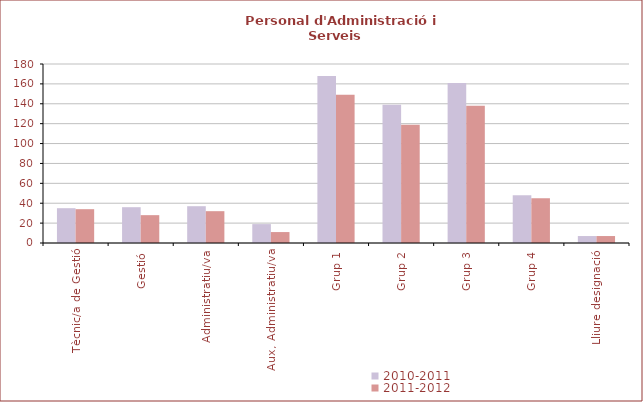
| Category | 2010-2011 | 2011-2012 |
|---|---|---|
| Tècnic/a de Gestió | 35 | 34 |
| Gestió | 36 | 28 |
| Administratiu/va | 37 | 32 |
| Aux, Administratiu/va | 19 | 11 |
| Grup 1 | 168 | 149 |
| Grup 2 | 139 | 119 |
| Grup 3 | 161 | 138 |
| Grup 4 | 48 | 45 |
| Lliure designació | 7 | 7 |